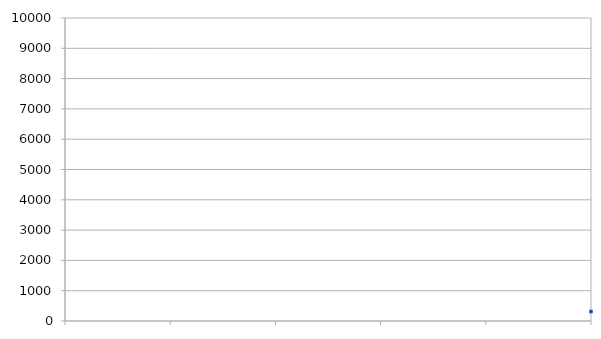
| Category | длины |
|---|---|
| 0 | 313 |
| 1 | 338 |
| 2 | 684 |
| 3 | 298 |
| 4 | 678 |
| 5 | 772 |
| 6 | 839 |
| 7 | 286 |
| 8 | 775 |
| 9 | 1319 |
| 10 | 887 |
| 11 | 441 |
| 12 | 1115 |
| 13 | 784 |
| 14 | 1188 |
| 15 | 815 |
| 16 | 444 |
| 17 | 231 |
| 18 | 725 |
| 19 | 113 |
| 20 | 1130 |
| 21 | 420 |
| 22 | 1179 |
| 23 | 787 |
| 24 | 869 |
| 25 | 1278 |
| 26 | 228 |
| 27 | 1534 |
| 28 | 1036 |
| 29 | 736 |
| 30 | 1319 |
| 31 | 1498 |
| 32 | 1528 |
| 33 | 866 |
| 34 | 850 |
| 35 | 575 |
| 36 | 1993 |
| 37 | 428 |
| 38 | 1051 |
| 39 | 259 |
| 40 | 1352 |
| 41 | 383 |
| 42 | 906 |
| 43 | 386 |
| 44 | 523 |
| 45 | 219 |
| 46 | 304 |
| 47 | 2133 |
| 48 | 486 |
| 49 | 1121 |
| 50 | 812 |
| 51 | 298 |
| 52 | 423 |
| 53 | 1926 |
| 54 | 465 |
| 55 | 225 |
| 56 | 298 |
| 57 | 1003 |
| 58 | 423 |
| 59 | 231 |
| 60 | 985 |
| 61 | 942 |
| 62 | 1061 |
| 63 | 2646 |
| 64 | 1094 |
| 65 | 848 |
| 66 | 1626 |
| 67 | 450 |
| 68 | 954 |
| 69 | 963 |
| 70 | 1109 |
| 71 | 1313 |
| 72 | 635 |
| 73 | 2166 |
| 74 | 1534 |
| 75 | 690 |
| 76 | 1334 |
| 77 | 815 |
| 78 | 632 |
| 79 | 903 |
| 80 | 736 |
| 81 | 404 |
| 82 | 924 |
| 83 | 617 |
| 84 | 183 |
| 85 | 711 |
| 86 | 705 |
| 87 | 802 |
| 88 | 1261 |
| 89 | 1413 |
| 90 | 1067 |
| 91 | 1273 |
| 92 | 423 |
| 93 | 286 |
| 94 | 875 |
| 95 | 1003 |
| 96 | 1367 |
| 97 | 493 |
| 98 | 559 |
| 99 | 593 |
| 100 | 401 |
| 101 | 408 |
| 102 | 2595 |
| 103 | 256 |
| 104 | 584 |
| 105 | 1398 |
| 106 | 268 |
| 107 | 1298 |
| 108 | 769 |
| 109 | 966 |
| 110 | 663 |
| 111 | 651 |
| 112 | 1562 |
| 113 | 1167 |
| 114 | 1550 |
| 115 | 587 |
| 116 | 1219 |
| 117 | 1273 |
| 118 | 2564 |
| 119 | 341 |
| 120 | 2640 |
| 121 | 793 |
| 122 | 547 |
| 123 | 1844 |
| 124 | 887 |
| 125 | 1009 |
| 126 | 790 |
| 127 | 1170 |
| 128 | 869 |
| 129 | 359 |
| 130 | 997 |
| 131 | 608 |
| 132 | 906 |
| 133 | 903 |
| 134 | 1000 |
| 135 | 189 |
| 136 | 860 |
| 137 | 429 |
| 138 | 1534 |
| 139 | 951 |
| 140 | 207 |
| 141 | 1416 |
| 142 | 1613 |
| 143 | 696 |
| 144 | 1474 |
| 145 | 602 |
| 146 | 329 |
| 147 | 237 |
| 148 | 338 |
| 149 | 383 |
| 150 | 1525 |
| 151 | 1191 |
| 152 | 520 |
| 153 | 453 |
| 154 | 1006 |
| 155 | 960 |
| 156 | 617 |
| 157 | 1750 |
| 158 | 726 |
| 159 | 1027 |
| 160 | 793 |
| 161 | 602 |
| 162 | 234 |
| 163 | 441 |
| 164 | 796 |
| 165 | 131 |
| 166 | 982 |
| 167 | 1009 |
| 168 | 310 |
| 169 | 909 |
| 170 | 505 |
| 171 | 994 |
| 172 | 663 |
| 173 | 1723 |
| 174 | 1462 |
| 175 | 1395 |
| 176 | 1088 |
| 177 | 1407 |
| 178 | 1219 |
| 179 | 1182 |
| 180 | 1440 |
| 181 | 201 |
| 182 | 960 |
| 183 | 979 |
| 184 | 960 |
| 185 | 1304 |
| 186 | 1489 |
| 187 | 1747 |
| 188 | 1173 |
| 189 | 1167 |
| 190 | 377 |
| 191 | 1376 |
| 192 | 1592 |
| 193 | 657 |
| 194 | 784 |
| 195 | 894 |
| 196 | 2017 |
| 197 | 1234 |
| 198 | 247 |
| 199 | 562 |
| 200 | 283 |
| 201 | 2488 |
| 202 | 790 |
| 203 | 1042 |
| 204 | 286 |
| 205 | 909 |
| 206 | 657 |
| 207 | 614 |
| 208 | 414 |
| 209 | 292 |
| 210 | 617 |
| 211 | 2364 |
| 212 | 556 |
| 213 | 344 |
| 214 | 444 |
| 215 | 623 |
| 216 | 565 |
| 217 | 675 |
| 218 | 951 |
| 219 | 1349 |
| 220 | 812 |
| 221 | 1419 |
| 222 | 1392 |
| 223 | 1358 |
| 224 | 228 |
| 225 | 784 |
| 226 | 608 |
| 227 | 617 |
| 228 | 1601 |
| 229 | 572 |
| 230 | 647 |
| 231 | 474 |
| 232 | 253 |
| 233 | 535 |
| 234 | 344 |
| 235 | 301 |
| 236 | 2710 |
| 237 | 1550 |
| 238 | 808 |
| 239 | 347 |
| 240 | 1140 |
| 241 | 1137 |
| 242 | 942 |
| 243 | 1146 |
| 244 | 1106 |
| 245 | 599 |
| 246 | 274 |
| 247 | 301 |
| 248 | 374 |
| 249 | 140 |
| 250 | 1680 |
| 251 | 1753 |
| 252 | 708 |
| 253 | 438 |
| 254 | 544 |
| 255 | 210 |
| 256 | 1240 |
| 257 | 1009 |
| 258 | 1632 |
| 259 | 1173 |
| 260 | 1000 |
| 261 | 766 |
| 262 | 1112 |
| 263 | 915 |
| 264 | 319 |
| 265 | 529 |
| 266 | 644 |
| 267 | 942 |
| 268 | 1626 |
| 269 | 1452 |
| 270 | 839 |
| 271 | 754 |
| 272 | 1294 |
| 273 | 1121 |
| 274 | 1015 |
| 275 | 465 |
| 276 | 985 |
| 277 | 827 |
| 278 | 818 |
| 279 | 1547 |
| 280 | 259 |
| 281 | 1465 |
| 282 | 897 |
| 283 | 635 |
| 284 | 1550 |
| 285 | 562 |
| 286 | 1571 |
| 287 | 1076 |
| 288 | 2200 |
| 289 | 675 |
| 290 | 663 |
| 291 | 356 |
| 292 | 195 |
| 293 | 2722 |
| 294 | 468 |
| 295 | 821 |
| 296 | 660 |
| 297 | 332 |
| 298 | 781 |
| 299 | 894 |
| 300 | 915 |
| 301 | 1173 |
| 302 | 1082 |
| 303 | 1118 |
| 304 | 1240 |
| 305 | 502 |
| 306 | 982 |
| 307 | 939 |
| 308 | 426 |
| 309 | 480 |
| 310 | 1258 |
| 311 | 1905 |
| 312 | 168 |
| 313 | 520 |
| 314 | 316 |
| 315 | 578 |
| 316 | 1209 |
| 317 | 821 |
| 318 | 860 |
| 319 | 769 |
| 320 | 262 |
| 321 | 842 |
| 322 | 490 |
| 323 | 344 |
| 324 | 708 |
| 325 | 289 |
| 326 | 1024 |
| 327 | 1182 |
| 328 | 726 |
| 329 | 2309 |
| 330 | 997 |
| 331 | 1954 |
| 332 | 137 |
| 333 | 292 |
| 334 | 392 |
| 335 | 374 |
| 336 | 623 |
| 337 | 657 |
| 338 | 329 |
| 339 | 717 |
| 340 | 319 |
| 341 | 329 |
| 342 | 553 |
| 343 | 632 |
| 344 | 584 |
| 345 | 1604 |
| 346 | 374 |
| 347 | 584 |
| 348 | 769 |
| 349 | 733 |
| 350 | 1073 |
| 351 | 860 |
| 352 | 502 |
| 353 | 860 |
| 354 | 1802 |
| 355 | 426 |
| 356 | 491 |
| 357 | 380 |
| 358 | 335 |
| 359 | 508 |
| 360 | 256 |
| 361 | 1188 |
| 362 | 1741 |
| 363 | 1820 |
| 364 | 854 |
| 365 | 289 |
| 366 | 222 |
| 367 | 213 |
| 368 | 584 |
| 369 | 745 |
| 370 | 414 |
| 371 | 177 |
| 372 | 447 |
| 373 | 429 |
| 374 | 280 |
| 375 | 1228 |
| 376 | 1328 |
| 377 | 909 |
| 378 | 365 |
| 379 | 286 |
| 380 | 496 |
| 381 | 1623 |
| 382 | 344 |
| 383 | 2965 |
| 384 | 884 |
| 385 | 304 |
| 386 | 1015 |
| 387 | 1389 |
| 388 | 417 |
| 389 | 177 |
| 390 | 972 |
| 391 | 1626 |
| 392 | 968 |
| 393 | 149 |
| 394 | 2121 |
| 395 | 228 |
| 396 | 912 |
| 397 | 1440 |
| 398 | 477 |
| 399 | 423 |
| 400 | 608 |
| 401 | 1127 |
| 402 | 541 |
| 403 | 1695 |
| 404 | 2306 |
| 405 | 486 |
| 406 | 954 |
| 407 | 1176 |
| 408 | 180 |
| 409 | 307 |
| 410 | 812 |
| 411 | 3363 |
| 412 | 1027 |
| 413 | 204 |
| 414 | 234 |
| 415 | 480 |
| 416 | 523 |
| 417 | 490 |
| 418 | 274 |
| 419 | 240 |
| 420 | 319 |
| 421 | 1647 |
| 422 | 189 |
| 423 | 216 |
| 424 | 641 |
| 425 | 909 |
| 426 | 629 |
| 427 | 326 |
| 428 | 626 |
| 429 | 909 |
| 430 | 596 |
| 431 | 1559 |
| 432 | 529 |
| 433 | 1556 |
| 434 | 1817 |
| 435 | 684 |
| 436 | 900 |
| 437 | 654 |
| 438 | 204 |
| 439 | 775 |
| 440 | 493 |
| 441 | 608 |
| 442 | 256 |
| 443 | 329 |
| 444 | 195 |
| 445 | 201 |
| 446 | 313 |
| 447 | 1729 |
| 448 | 322 |
| 449 | 183 |
| 450 | 1015 |
| 451 | 374 |
| 452 | 83 |
| 453 | 760 |
| 454 | 2279 |
| 455 | 1109 |
| 456 | 599 |
| 457 | 459 |
| 458 | 720 |
| 459 | 708 |
| 460 | 1516 |
| 461 | 869 |
| 462 | 720 |
| 463 | 1337 |
| 464 | 1018 |
| 465 | 1674 |
| 466 | 2048 |
| 467 | 775 |
| 468 | 1073 |
| 469 | 3144 |
| 470 | 556 |
| 471 | 295 |
| 472 | 514 |
| 473 | 824 |
| 474 | 511 |
| 475 | 635 |
| 476 | 1465 |
| 477 | 128 |
| 478 | 274 |
| 479 | 821 |
| 480 | 702 |
| 481 | 1477 |
| 482 | 1191 |
| 483 | 526 |
| 484 | 854 |
| 485 | 1039 |
| 486 | 1404 |
| 487 | 2294 |
| 488 | 1465 |
| 489 | 456 |
| 490 | 429 |
| 491 | 684 |
| 492 | 802 |
| 493 | 140 |
| 494 | 438 |
| 495 | 201 |
| 496 | 930 |
| 497 | 271 |
| 498 | 1155 |
| 499 | 1261 |
| 500 | 368 |
| 501 | 994 |
| 502 | 289 |
| 503 | 1653 |
| 504 | 256 |
| 505 | 253 |
| 506 | 666 |
| 507 | 641 |
| 508 | 1501 |
| 509 | 499 |
| 510 | 2087 |
| 511 | 2847 |
| 512 | 1471 |
| 513 | 1680 |
| 514 | 1137 |
| 515 | 1033 |
| 516 | 450 |
| 517 | 219 |
| 518 | 1389 |
| 519 | 1367 |
| 520 | 708 |
| 521 | 884 |
| 522 | 2516 |
| 523 | 195 |
| 524 | 678 |
| 525 | 371 |
| 526 | 438 |
| 527 | 918 |
| 528 | 611 |
| 529 | 638 |
| 530 | 748 |
| 531 | 1282 |
| 532 | 1024 |
| 533 | 824 |
| 534 | 441 |
| 535 | 751 |
| 536 | 368 |
| 537 | 805 |
| 538 | 499 |
| 539 | 474 |
| 540 | 1185 |
| 541 | 1173 |
| 542 | 2306 |
| 543 | 894 |
| 544 | 957 |
| 545 | 957 |
| 546 | 195 |
| 547 | 1975 |
| 548 | 1370 |
| 549 | 562 |
| 550 | 818 |
| 551 | 1194 |
| 552 | 880 |
| 553 | 322 |
| 554 | 2039 |
| 555 | 729 |
| 556 | 757 |
| 557 | 921 |
| 558 | 605 |
| 559 | 538 |
| 560 | 438 |
| 561 | 1006 |
| 562 | 1012 |
| 563 | 1304 |
| 564 | 666 |
| 565 | 1519 |
| 566 | 1030 |
| 567 | 480 |
| 568 | 994 |
| 569 | 1118 |
| 570 | 1349 |
| 571 | 778 |
| 572 | 435 |
| 573 | 1109 |
| 574 | 1106 |
| 575 | 799 |
| 576 | 453 |
| 577 | 1127 |
| 578 | 976 |
| 579 | 897 |
| 580 | 2847 |
| 581 | 1255 |
| 582 | 268 |
| 583 | 1419 |
| 584 | 1188 |
| 585 | 772 |
| 586 | 678 |
| 587 | 1349 |
| 588 | 808 |
| 589 | 1847 |
| 590 | 1632 |
| 591 | 1237 |
| 592 | 745 |
| 593 | 790 |
| 594 | 228 |
| 595 | 769 |
| 596 | 939 |
| 597 | 736 |
| 598 | 565 |
| 599 | 751 |
| 600 | 790 |
| 601 | 1173 |
| 602 | 1149 |
| 603 | 2670 |
| 604 | 669 |
| 605 | 486 |
| 606 | 228 |
| 607 | 1124 |
| 608 | 556 |
| 609 | 192 |
| 610 | 1838 |
| 611 | 930 |
| 612 | 957 |
| 613 | 1498 |
| 614 | 165 |
| 615 | 189 |
| 616 | 414 |
| 617 | 486 |
| 618 | 174 |
| 619 | 1258 |
| 620 | 824 |
| 621 | 887 |
| 622 | 1161 |
| 623 | 344 |
| 624 | 1623 |
| 625 | 1905 |
| 626 | 459 |
| 627 | 848 |
| 628 | 960 |
| 629 | 644 |
| 630 | 714 |
| 631 | 690 |
| 632 | 444 |
| 633 | 2288 |
| 634 | 1301 |
| 635 | 1383 |
| 636 | 839 |
| 637 | 1656 |
| 638 | 985 |
| 639 | 1462 |
| 640 | 772 |
| 641 | 736 |
| 642 | 277 |
| 643 | 2707 |
| 644 | 307 |
| 645 | 1182 |
| 646 | 1109 |
| 647 | 1401 |
| 648 | 1237 |
| 649 | 763 |
| 650 | 389 |
| 651 | 1610 |
| 652 | 2719 |
| 653 | 748 |
| 654 | 830 |
| 655 | 2209 |
| 656 | 1534 |
| 657 | 1234 |
| 658 | 474 |
| 659 | 547 |
| 660 | 389 |
| 661 | 647 |
| 662 | 1003 |
| 663 | 1127 |
| 664 | 493 |
| 665 | 726 |
| 666 | 772 |
| 667 | 1270 |
| 668 | 666 |
| 669 | 909 |
| 670 | 4296 |
| 671 | 420 |
| 672 | 745 |
| 673 | 751 |
| 674 | 1534 |
| 675 | 1149 |
| 676 | 1811 |
| 677 | 493 |
| 678 | 2014 |
| 679 | 954 |
| 680 | 429 |
| 681 | 966 |
| 682 | 468 |
| 683 | 435 |
| 684 | 395 |
| 685 | 234 |
| 686 | 240 |
| 687 | 198 |
| 688 | 338 |
| 689 | 2427 |
| 690 | 2965 |
| 691 | 243 |
| 692 | 310 |
| 693 | 432 |
| 694 | 651 |
| 695 | 884 |
| 696 | 632 |
| 697 | 599 |
| 698 | 3615 |
| 699 | 1188 |
| 700 | 559 |
| 701 | 3582 |
| 702 | 2534 |
| 703 | 2105 |
| 704 | 4806 |
| 705 | 222 |
| 706 | 2737 |
| 707 | 1455 |
| 708 | 857 |
| 709 | 1750 |
| 710 | 775 |
| 711 | 985 |
| 712 | 608 |
| 713 | 532 |
| 714 | 414 |
| 715 | 398 |
| 716 | 2576 |
| 717 | 821 |
| 718 | 915 |
| 719 | 1358 |
| 720 | 769 |
| 721 | 581 |
| 722 | 292 |
| 723 | 335 |
| 724 | 468 |
| 725 | 243 |
| 726 | 702 |
| 727 | 3166 |
| 728 | 1887 |
| 729 | 1182 |
| 730 | 3439 |
| 731 | 2643 |
| 732 | 693 |
| 733 | 1030 |
| 734 | 1030 |
| 735 | 657 |
| 736 | 486 |
| 737 | 787 |
| 738 | 772 |
| 739 | 951 |
| 740 | 754 |
| 741 | 261 |
| 742 | 550 |
| 743 | 204 |
| 744 | 1240 |
| 745 | 1428 |
| 746 | 945 |
| 747 | 881 |
| 748 | 748 |
| 749 | 976 |
| 750 | 1598 |
| 751 | 149 |
| 752 | 805 |
| 753 | 666 |
| 754 | 256 |
| 755 | 1407 |
| 756 | 2096 |
| 757 | 1383 |
| 758 | 350 |
| 759 | 587 |
| 760 | 1541 |
| 761 | 477 |
| 762 | 1012 |
| 763 | 1726 |
| 764 | 988 |
| 765 | 192 |
| 766 | 204 |
| 767 | 268 |
| 768 | 2704 |
| 769 | 243 |
| 770 | 711 |
| 771 | 666 |
| 772 | 1240 |
| 773 | 356 |
| 774 | 1322 |
| 775 | 675 |
| 776 | 344 |
| 777 | 739 |
| 778 | 1884 |
| 779 | 736 |
| 780 | 547 |
| 781 | 641 |
| 782 | 310 |
| 783 | 347 |
| 784 | 253 |
| 785 | 942 |
| 786 | 1395 |
| 787 | 326 |
| 788 | 2394 |
| 789 | 1923 |
| 790 | 696 |
| 791 | 502 |
| 792 | 1085 |
| 793 | 532 |
| 794 | 951 |
| 795 | 2999 |
| 796 | 523 |
| 797 | 417 |
| 798 | 335 |
| 799 | 460 |
| 800 | 1951 |
| 801 | 477 |
| 802 | 332 |
| 803 | 1844 |
| 804 | 429 |
| 805 | 2096 |
| 806 | 204 |
| 807 | 1313 |
| 808 | 572 |
| 809 | 259 |
| 810 | 447 |
| 811 | 939 |
| 812 | 784 |
| 813 | 720 |
| 814 | 365 |
| 815 | 1592 |
| 816 | 945 |
| 817 | 705 |
| 818 | 3275 |
| 819 | 192 |
| 820 | 408 |
| 821 | 326 |
| 822 | 796 |
| 823 | 231 |
| 824 | 502 |
| 825 | 635 |
| 826 | 1938 |
| 827 | 1698 |
| 828 | 796 |
| 829 | 219 |
| 830 | 942 |
| 831 | 1504 |
| 832 | 274 |
| 833 | 1692 |
| 834 | 517 |
| 835 | 657 |
| 836 | 1252 |
| 837 | 1373 |
| 838 | 1015 |
| 839 | 982 |
| 840 | 787 |
| 841 | 824 |
| 842 | 538 |
| 843 | 669 |
| 844 | 1741 |
| 845 | 745 |
| 846 | 1061 |
| 847 | 1225 |
| 848 | 404 |
| 849 | 802 |
| 850 | 651 |
| 851 | 8852 |
| 852 | 714 |
| 853 | 1413 |
| 854 | 2187 |
| 855 | 963 |
| 856 | 1291 |
| 857 | 1070 |
| 858 | 2002 |
| 859 | 444 |
| 860 | 432 |
| 861 | 675 |
| 862 | 860 |
| 863 | 1337 |
| 864 | 1158 |
| 865 | 1328 |
| 866 | 720 |
| 867 | 2121 |
| 868 | 265 |
| 869 | 1531 |
| 870 | 477 |
| 871 | 1146 |
| 872 | 292 |
| 873 | 1504 |
| 874 | 298 |
| 875 | 423 |
| 876 | 1522 |
| 877 | 930 |
| 878 | 301 |
| 879 | 3251 |
| 880 | 2479 |
| 881 | 942 |
| 882 | 520 |
| 883 | 1222 |
| 884 | 2500 |
| 885 | 2194 |
| 886 | 1276 |
| 887 | 1468 |
| 888 | 1932 |
| 889 | 508 |
| 890 | 663 |
| 891 | 295 |
| 892 | 860 |
| 893 | 997 |
| 894 | 884 |
| 895 | 945 |
| 896 | 1668 |
| 897 | 623 |
| 898 | 301 |
| 899 | 1067 |
| 900 | 468 |
| 901 | 1331 |
| 902 | 444 |
| 903 | 201 |
| 904 | 666 |
| 905 | 1121 |
| 906 | 1103 |
| 907 | 341 |
| 908 | 948 |
| 909 | 1632 |
| 910 | 329 |
| 911 | 2427 |
| 912 | 277 |
| 913 | 377 |
| 914 | 541 |
| 915 | 1228 |
| 916 | 687 |
| 917 | 2297 |
| 918 | 924 |
| 919 | 2194 |
| 920 | 2689 |
| 921 | 951 |
| 922 | 1808 |
| 923 | 295 |
| 924 | 1735 |
| 925 | 644 |
| 926 | 256 |
| 927 | 1370 |
| 928 | 341 |
| 929 | 2306 |
| 930 | 401 |
| 931 | 477 |
| 932 | 556 |
| 933 | 927 |
| 934 | 465 |
| 935 | 1328 |
| 936 | 447 |
| 937 | 1340 |
| 938 | 863 |
| 939 | 839 |
| 940 | 155 |
| 941 | 1258 |
| 942 | 654 |
| 943 | 915 |
| 944 | 1133 |
| 945 | 353 |
| 946 | 2768 |
| 947 | 1298 |
| 948 | 1288 |
| 949 | 881 |
| 950 | 292 |
| 951 | 1668 |
| 952 | 1410 |
| 953 | 969 |
| 954 | 1273 |
| 955 | 2434 |
| 956 | 1240 |
| 957 | 387 |
| 958 | 1458 |
| 959 | 1811 |
| 960 | 757 |
| 961 | 766 |
| 962 | 884 |
| 963 | 1222 |
| 964 | 2695 |
| 965 | 465 |
| 966 | 821 |
| 967 | 1483 |
| 968 | 1258 |
| 969 | 799 |
| 970 | 1458 |
| 971 | 441 |
| 972 | 1355 |
| 973 | 538 |
| 974 | 1337 |
| 975 | 736 |
| 976 | 426 |
| 977 | 611 |
| 978 | 2033 |
| 979 | 1130 |
| 980 | 1349 |
| 981 | 866 |
| 982 | 1285 |
| 983 | 729 |
| 984 | 1601 |
| 985 | 1009 |
| 986 | 590 |
| 987 | 520 |
| 988 | 626 |
| 989 | 979 |
| 990 | 1850 |
| 991 | 1480 |
| 992 | 1158 |
| 993 | 268 |
| 994 | 698 |
| 995 | 1033 |
| 996 | 2206 |
| 997 | 1225 |
| 998 | 1692 |
| 999 | 599 |
| 1000 | 617 |
| 1001 | 854 |
| 1002 | 787 |
| 1003 | 897 |
| 1004 | 1073 |
| 1005 | 1173 |
| 1006 | 890 |
| 1007 | 638 |
| 1008 | 945 |
| 1009 | 781 |
| 1010 | 462 |
| 1011 | 1301 |
| 1012 | 414 |
| 1013 | 1416 |
| 1014 | 675 |
| 1015 | 960 |
| 1016 | 508 |
| 1017 | 1018 |
| 1018 | 1367 |
| 1019 | 751 |
| 1020 | 429 |
| 1021 | 432 |
| 1022 | 486 |
| 1023 | 635 |
| 1024 | 581 |
| 1025 | 477 |
| 1026 | 1404 |
| 1027 | 2929 |
| 1028 | 174 |
| 1029 | 596 |
| 1030 | 1179 |
| 1031 | 3214 |
| 1032 | 1419 |
| 1033 | 493 |
| 1034 | 438 |
| 1035 | 660 |
| 1036 | 775 |
| 1037 | 708 |
| 1038 | 1027 |
| 1039 | 614 |
| 1040 | 195 |
| 1041 | 1626 |
| 1042 | 991 |
| 1043 | 644 |
| 1044 | 1285 |
| 1045 | 2610 |
| 1046 | 708 |
| 1047 | 927 |
| 1048 | 976 |
| 1049 | 408 |
| 1050 | 663 |
| 1051 | 1067 |
| 1052 | 1431 |
| 1053 | 344 |
| 1054 | 842 |
| 1055 | 772 |
| 1056 | 1361 |
| 1057 | 1331 |
| 1058 | 933 |
| 1059 | 1100 |
| 1060 | 1143 |
| 1061 | 982 |
| 1062 | 969 |
| 1063 | 942 |
| 1064 | 1416 |
| 1065 | 1307 |
| 1066 | 836 |
| 1067 | 930 |
| 1068 | 1376 |
| 1069 | 1446 |
| 1070 | 836 |
| 1071 | 1191 |
| 1072 | 201 |
| 1073 | 584 |
| 1074 | 237 |
| 1075 | 477 |
| 1076 | 1127 |
| 1077 | 2096 |
| 1078 | 535 |
| 1079 | 930 |
| 1080 | 1061 |
| 1081 | 1796 |
| 1082 | 520 |
| 1083 | 471 |
| 1084 | 1288 |
| 1085 | 532 |
| 1086 | 1115 |
| 1087 | 687 |
| 1088 | 1650 |
| 1089 | 578 |
| 1090 | 623 |
| 1091 | 897 |
| 1092 | 927 |
| 1093 | 900 |
| 1094 | 2294 |
| 1095 | 2737 |
| 1096 | 508 |
| 1097 | 720 |
| 1098 | 113 |
| 1099 | 4350 |
| 1100 | 1428 |
| 1101 | 875 |
| 1102 | 1762 |
| 1103 | 1537 |
| 1104 | 960 |
| 1105 | 985 |
| 1106 | 1513 |
| 1107 | 1401 |
| 1108 | 1744 |
| 1109 | 1471 |
| 1110 | 228 |
| 1111 | 1276 |
| 1112 | 1033 |
| 1113 | 1240 |
| 1114 | 912 |
| 1115 | 493 |
| 1116 | 1395 |
| 1117 | 1282 |
| 1118 | 720 |
| 1119 | 1480 |
| 1120 | 733 |
| 1121 | 143 |
| 1122 | 453 |
| 1123 | 1966 |
| 1124 | 535 |
| 1125 | 417 |
| 1126 | 644 |
| 1127 | 1954 |
| 1128 | 471 |
| 1129 | 1267 |
| 1130 | 699 |
| 1131 | 1832 |
| 1132 | 3582 |
| 1133 | 1082 |
| 1134 | 517 |
| 1135 | 535 |
| 1136 | 1826 |
| 1137 | 714 |
| 1138 | 1674 |
| 1139 | 1644 |
| 1140 | 912 |
| 1141 | 726 |
| 1142 | 362 |
| 1143 | 1413 |
| 1144 | 1222 |
| 1145 | 1209 |
| 1146 | 1188 |
| 1147 | 1222 |
| 1148 | 802 |
| 1149 | 1604 |
| 1150 | 1006 |
| 1151 | 1237 |
| 1152 | 815 |
| 1153 | 623 |
| 1154 | 1097 |
| 1155 | 2622 |
| 1156 | 921 |
| 1157 | 292 |
| 1158 | 723 |
| 1159 | 836 |
| 1160 | 1525 |
| 1161 | 1364 |
| 1162 | 723 |
| 1163 | 1434 |
| 1164 | 1553 |
| 1165 | 444 |
| 1166 | 2194 |
| 1167 | 1021 |
| 1168 | 2011 |
| 1169 | 377 |
| 1170 | 1610 |
| 1171 | 1061 |
| 1172 | 1188 |
| 1173 | 1103 |
| 1174 | 587 |
| 1175 | 1547 |
| 1176 | 1319 |
| 1177 | 550 |
| 1178 | 192 |
| 1179 | 131 |
| 1180 | 1811 |
| 1181 | 471 |
| 1182 | 474 |
| 1183 | 717 |
| 1184 | 183 |
| 1185 | 356 |
| 1186 | 247 |
| 1187 | 432 |
| 1188 | 553 |
| 1189 | 368 |
| 1190 | 195 |
| 1191 | 2017 |
| 1192 | 486 |
| 1193 | 6139 |
| 1194 | 2051 |
| 1195 | 532 |
| 1196 | 468 |
| 1197 | 1847 |
| 1198 | 629 |
| 1199 | 660 |
| 1200 | 1367 |
| 1201 | 404 |
| 1202 | 453 |
| 1203 | 1027 |
| 1204 | 490 |
| 1205 | 335 |
| 1206 | 319 |
| 1207 | 1626 |
| 1208 | 149 |
| 1209 | 177 |
| 1210 | 1452 |
| 1211 | 720 |
| 1212 | 408 |
| 1213 | 690 |
| 1214 | 687 |
| 1215 | 356 |
| 1216 | 240 |
| 1217 | 942 |
| 1218 | 602 |
| 1219 | 614 |
| 1220 | 456 |
| 1221 | 165 |
| 1222 | 292 |
| 1223 | 283 |
| 1224 | 225 |
| 1225 | 766 |
| 1226 | 408 |
| 1227 | 219 |
| 1228 | 356 |
| 1229 | 389 |
| 1230 | 769 |
| 1231 | 247 |
| 1232 | 1188 |
| 1233 | 468 |
| 1234 | 155 |
| 1235 | 262 |
| 1236 | 277 |
| 1237 | 681 |
| 1238 | 298 |
| 1239 | 362 |
| 1240 | 368 |
| 1241 | 304 |
| 1242 | 1143 |
| 1243 | 2245 |
| 1244 | 1039 |
| 1245 | 690 |
| 1246 | 772 |
| 1247 | 1474 |
| 1248 | 490 |
| 1249 | 569 |
| 1250 | 559 |
| 1251 | 1428 |
| 1252 | 286 |
| 1253 | 745 |
| 1254 | 660 |
| 1255 | 997 |
| 1256 | 483 |
| 1257 | 526 |
| 1258 | 1182 |
| 1259 | 1033 |
| 1260 | 1124 |
| 1261 | 1465 |
| 1262 | 2294 |
| 1263 | 1392 |
| 1264 | 490 |
| 1265 | 1349 |
| 1266 | 802 |
| 1267 | 1313 |
| 1268 | 644 |
| 1269 | 790 |
| 1270 | 784 |
| 1271 | 1583 |
| 1272 | 976 |
| 1273 | 651 |
| 1274 | 1179 |
| 1275 | 1051 |
| 1276 | 204 |
| 1277 | 432 |
| 1278 | 2765 |
| 1279 | 1243 |
| 1280 | 808 |
| 1281 | 620 |
| 1282 | 326 |
| 1283 | 3488 |
| 1284 | 3014 |
| 1285 | 720 |
| 1286 | 1000 |
| 1287 | 465 |
| 1288 | 2376 |
| 1289 | 1708 |
| 1290 | 1389 |
| 1291 | 216 |
| 1292 | 1301 |
| 1293 | 815 |
| 1294 | 988 |
| 1295 | 1298 |
| 1296 | 1051 |
| 1297 | 1726 |
| 1298 | 480 |
| 1299 | 2163 |
| 1300 | 335 |
| 1301 | 438 |
| 1302 | 693 |
| 1303 | 1686 |
| 1304 | 796 |
| 1305 | 1027 |
| 1306 | 2345 |
| 1307 | 274 |
| 1308 | 933 |
| 1309 | 590 |
| 1310 | 906 |
| 1311 | 408 |
| 1312 | 2622 |
| 1313 | 666 |
| 1314 | 237 |
| 1315 | 1592 |
| 1316 | 532 |
| 1317 | 1149 |
| 1318 | 1656 |
| 1319 | 383 |
| 1320 | 751 |
| 1321 | 1975 |
| 1322 | 1522 |
| 1323 | 985 |
| 1324 | 1276 |
| 1325 | 237 |
| 1326 | 751 |
| 1327 | 818 |
| 1328 | 948 |
| 1329 | 1489 |
| 1330 | 1534 |
| 1331 | 711 |
| 1332 | 1222 |
| 1333 | 365 |
| 1334 | 1422 |
| 1335 | 411 |
| 1336 | 228 |
| 1337 | 605 |
| 1338 | 380 |
| 1339 | 158 |
| 1340 | 216 |
| 1341 | 1422 |
| 1342 | 1167 |
| 1343 | 881 |
| 1344 | 1413 |
| 1345 | 1452 |
| 1346 | 799 |
| 1347 | 301 |
| 1348 | 1653 |
| 1349 | 447 |
| 1350 | 802 |
| 1351 | 335 |
| 1352 | 401 |
| 1353 | 1501 |
| 1354 | 490 |
| 1355 | 675 |
| 1356 | 465 |
| 1357 | 562 |
| 1358 | 775 |
| 1359 | 2992 |
| 1360 | 705 |
| 1361 | 496 |
| 1362 | 1310 |
| 1363 | 693 |
| 1364 | 423 |
| 1365 | 717 |
| 1366 | 906 |
| 1367 | 729 |
| 1368 | 608 |
| 1369 | 915 |
| 1370 | 1082 |
| 1371 | 675 |
| 1372 | 347 |
| 1373 | 1404 |
| 1374 | 483 |
| 1375 | 596 |
| 1376 | 626 |
| 1377 | 748 |
| 1378 | 775 |
| 1379 | 240 |
| 1380 | 326 |
| 1381 | 590 |
| 1382 | 918 |
| 1383 | 1474 |
| 1384 | 289 |
| 1385 | 690 |
| 1386 | 733 |
| 1387 | 705 |
| 1388 | 262 |
| 1389 | 684 |
| 1390 | 1328 |
| 1391 | 389 |
| 1392 | 705 |
| 1393 | 225 |
| 1394 | 924 |
| 1395 | 1343 |
| 1396 | 748 |
| 1397 | 757 |
| 1398 | 462 |
| 1399 | 872 |
| 1400 | 976 |
| 1401 | 687 |
| 1402 | 432 |
| 1403 | 493 |
| 1404 | 812 |
| 1405 | 2555 |
| 1406 | 830 |
| 1407 | 1264 |
| 1408 | 881 |
| 1409 | 1765 |
| 1410 | 1762 |
| 1411 | 763 |
| 1412 | 1155 |
| 1413 | 1343 |
| 1414 | 763 |
| 1415 | 1149 |
| 1416 | 1367 |
| 1417 | 1920 |
| 1418 | 1541 |
| 1419 | 1246 |
| 1420 | 1076 |
| 1421 | 857 |
| 1422 | 1252 |
| 1423 | 1607 |
| 1424 | 945 |
| 1425 | 1531 |
| 1426 | 654 |
| 1427 | 1249 |
| 1428 | 1531 |
| 1429 | 1021 |
| 1430 | 295 |
| 1431 | 660 |
| 1432 | 222 |
| 1433 | 1194 |
| 1434 | 1328 |
| 1435 | 872 |
| 1436 | 398 |
| 1437 | 447 |
| 1438 | 307 |
| 1439 | 289 |
| 1440 | 414 |
| 1441 | 957 |
| 1442 | 389 |
| 1443 | 502 |
| 1444 | 575 |
| 1445 | 620 |
| 1446 | 1225 |
| 1447 | 1774 |
| 1448 | 2318 |
| 1449 | 933 |
| 1450 | 149 |
| 1451 | 775 |
| 1452 | 1747 |
| 1453 | 1422 |
| 1454 | 793 |
| 1455 | 763 |
| 1456 | 234 |
| 1457 | 684 |
| 1458 | 890 |
| 1459 | 957 |
| 1460 | 1771 |
| 1461 | 350 |
| 1462 | 523 |
| 1463 | 1033 |
| 1464 | 632 |
| 1465 | 771 |
| 1466 | 1695 |
| 1467 | 1370 |
| 1468 | 1319 |
| 1469 | 1355 |
| 1470 | 471 |
| 1471 | 651 |
| 1472 | 2066 |
| 1473 | 620 |
| 1474 | 693 |
| 1475 | 1401 |
| 1476 | 1091 |
| 1477 | 316 |
| 1478 | 1291 |
| 1479 | 629 |
| 1480 | 319 |
| 1481 | 329 |
| 1482 | 596 |
| 1483 | 225 |
| 1484 | 647 |
| 1485 | 483 |
| 1486 | 3378 |
| 1487 | 374 |
| 1488 | 1179 |
| 1489 | 459 |
| 1490 | 395 |
| 1491 | 1920 |
| 1492 | 2072 |
| 1493 | 708 |
| 1494 | 857 |
| 1495 | 420 |
| 1496 | 1042 |
| 1497 | 1398 |
| 1498 | 1191 |
| 1499 | 1103 |
| 1500 | 1234 |
| 1501 | 359 |
| 1502 | 1106 |
| 1503 | 2090 |
| 1504 | 274 |
| 1505 | 3509 |
| 1506 | 417 |
| 1507 | 757 |
| 1508 | 2039 |
| 1509 | 1024 |
| 1510 | 787 |
| 1511 | 1322 |
| 1512 | 550 |
| 1513 | 729 |
| 1514 | 1036 |
| 1515 | 1042 |
| 1516 | 878 |
| 1517 | 1146 |
| 1518 | 183 |
| 1519 | 972 |
| 1520 | 1969 |
| 1521 | 687 |
| 1522 | 265 |
| 1523 | 1659 |
| 1524 | 793 |
| 1525 | 717 |
| 1526 | 1455 |
| 1527 | 1592 |
| 1528 | 2075 |
| 1529 | 310 |
| 1530 | 620 |
| 1531 | 493 |
| 1532 | 1064 |
| 1533 | 2033 |
| 1534 | 742 |
| 1535 | 1334 |
| 1536 | 678 |
| 1537 | 1252 |
| 1538 | 906 |
| 1539 | 562 |
| 1540 | 380 |
| 1541 | 824 |
| 1542 | 572 |
| 1543 | 578 |
| 1544 | 1103 |
| 1545 | 702 |
| 1546 | 736 |
| 1547 | 909 |
| 1548 | 1219 |
| 1549 | 1024 |
| 1550 | 1993 |
| 1551 | 216 |
| 1552 | 341 |
| 1553 | 587 |
| 1554 | 247 |
| 1555 | 1170 |
| 1556 | 474 |
| 1557 | 1264 |
| 1558 | 1061 |
| 1559 | 1313 |
| 1560 | 948 |
| 1561 | 298 |
| 1562 | 499 |
| 1563 | 1061 |
| 1564 | 1331 |
| 1565 | 480 |
| 1566 | 192 |
| 1567 | 2522 |
| 1568 | 912 |
| 1569 | 1143 |
| 1570 | 769 |
| 1571 | 884 |
| 1572 | 1431 |
| 1573 | 884 |
| 1574 | 341 |
| 1575 | 684 |
| 1576 | 663 |
| 1577 | 1370 |
| 1578 | 4223 |
| 1579 | 2084 |
| 1580 | 477 |
| 1581 | 183 |
| 1582 | 161 |
| 1583 | 371 |
| 1584 | 471 |
| 1585 | 575 |
| 1586 | 101 |
| 1587 | 447 |
| 1588 | 1294 |
| 1589 | 784 |
| 1590 | 1064 |
| 1591 | 1401 |
| 1592 | 866 |
| 1593 | 207 |
| 1594 | 1416 |
| 1595 | 414 |
| 1596 | 921 |
| 1597 | 957 |
| 1598 | 207 |
| 1599 | 177 |
| 1600 | 1346 |
| 1601 | 771 |
| 1602 | 830 |
| 1603 | 969 |
| 1604 | 271 |
| 1605 | 544 |
| 1606 | 1729 |
| 1607 | 693 |
| 1608 | 1042 |
| 1609 | 875 |
| 1610 | 1030 |
| 1611 | 201 |
| 1612 | 2352 |
| 1613 | 638 |
| 1614 | 748 |
| 1615 | 565 |
| 1616 | 559 |
| 1617 | 1091 |
| 1618 | 511 |
| 1619 | 2227 |
| 1620 | 365 |
| 1621 | 830 |
| 1622 | 2358 |
| 1623 | 547 |
| 1624 | 201 |
| 1625 | 280 |
| 1626 | 414 |
| 1627 | 329 |
| 1628 | 401 |
| 1629 | 225 |
| 1630 | 493 |
| 1631 | 1127 |
| 1632 | 398 |
| 1633 | 326 |
| 1634 | 1146 |
| 1635 | 344 |
| 1636 | 1331 |
| 1637 | 444 |
| 1638 | 572 |
| 1639 | 799 |
| 1640 | 247 |
| 1641 | 644 |
| 1642 | 1601 |
| 1643 | 1222 |
| 1644 | 717 |
| 1645 | 705 |
| 1646 | 529 |
| 1647 | 924 |
| 1648 | 2391 |
| 1649 | 1425 |
| 1650 | 1689 |
| 1651 | 1073 |
| 1652 | 365 |
| 1653 | 1577 |
| 1654 | 277 |
| 1655 | 1009 |
| 1656 | 256 |
| 1657 | 2582 |
| 1658 | 945 |
| 1659 | 453 |
| 1660 | 353 |
| 1661 | 432 |
| 1662 | 784 |
| 1663 | 1061 |
| 1664 | 903 |
| 1665 | 210 |
| 1666 | 796 |
| 1667 | 815 |
| 1668 | 1462 |
| 1669 | 942 |
| 1670 | 1762 |
| 1671 | 1310 |
| 1672 | 796 |
| 1673 | 915 |
| 1674 | 2341 |
| 1675 | 592 |
| 1676 | 256 |
| 1677 | 271 |
| 1678 | 1124 |
| 1679 | 754 |
| 1680 | 341 |
| 1681 | 581 |
| 1682 | 2995 |
| 1683 | 596 |
| 1684 | 1197 |
| 1685 | 1021 |
| 1686 | 216 |
| 1687 | 180 |
| 1688 | 219 |
| 1689 | 350 |
| 1690 | 942 |
| 1691 | 760 |
| 1692 | 1215 |
| 1693 | 338 |
| 1694 | 404 |
| 1695 | 183 |
| 1696 | 1206 |
| 1697 | 1416 |
| 1698 | 1073 |
| 1699 | 927 |
| 1700 | 772 |
| 1701 | 1021 |
| 1702 | 1055 |
| 1703 | 386 |
| 1704 | 480 |
| 1705 | 1273 |
| 1706 | 3615 |
| 1707 | 1610 |
| 1708 | 857 |
| 1709 | 881 |
| 1710 | 1753 |
| 1711 | 581 |
| 1712 | 693 |
| 1713 | 341 |
| 1714 | 681 |
| 1715 | 1626 |
| 1716 | 280 |
| 1717 | 620 |
| 1718 | 590 |
| 1719 | 423 |
| 1720 | 392 |
| 1721 | 769 |
| 1722 | 942 |
| 1723 | 201 |
| 1724 | 647 |
| 1725 | 477 |
| 1726 | 195 |
| 1727 | 225 |
| 1728 | 379 |
| 1729 | 1076 |
| 1730 | 1091 |
| 1731 | 1121 |
| 1732 | 1118 |
| 1733 | 1097 |
| 1734 | 1088 |
| 1735 | 1143 |
| 1736 | 635 |
| 1737 | 836 |
| 1738 | 936 |
| 1739 | 1130 |
| 1740 | 1003 |
| 1741 | 1042 |
| 1742 | 286 |
| 1743 | 1392 |
| 1744 | 1103 |
| 1745 | 401 |
| 1746 | 994 |
| 1747 | 1282 |
| 1748 | 739 |
| 1749 | 243 |
| 1750 | 2093 |
| 1751 | 547 |
| 1752 | 359 |
| 1753 | 915 |
| 1754 | 152 |
| 1755 | 623 |
| 1756 | 496 |
| 1757 | 1051 |
| 1758 | 417 |
| 1759 | 651 |
| 1760 | 228 |
| 1761 | 778 |
| 1762 | 985 |
| 1763 | 286 |
| 1764 | 502 |
| 1765 | 383 |
| 1766 | 827 |
| 1767 | 316 |
| 1768 | 1616 |
| 1769 | 717 |
| 1770 | 1616 |
| 1771 | 456 |
| 1772 | 945 |
| 1773 | 411 |
| 1774 | 277 |
| 1775 | 1009 |
| 1776 | 1838 |
| 1777 | 395 |
| 1778 | 401 |
| 1779 | 1349 |
| 1780 | 562 |
| 1781 | 1058 |
| 1782 | 523 |
| 1783 | 726 |
| 1784 | 638 |
| 1785 | 808 |
| 1786 | 1325 |
| 1787 | 532 |
| 1788 | 2628 |
| 1789 | 171 |
| 1790 | 374 |
| 1791 | 742 |
| 1792 | 277 |
| 1793 | 486 |
| 1794 | 474 |
| 1795 | 1471 |
| 1796 | 1340 |
| 1797 | 186 |
| 1798 | 523 |
| 1799 | 1386 |
| 1800 | 708 |
| 1801 | 708 |
| 1802 | 857 |
| 1803 | 1091 |
| 1804 | 371 |
| 1805 | 444 |
| 1806 | 2412 |
| 1807 | 280 |
| 1808 | 435 |
| 1809 | 611 |
| 1810 | 824 |
| 1811 | 687 |
| 1812 | 550 |
| 1813 | 1030 |
| 1814 | 693 |
| 1815 | 775 |
| 1816 | 2595 |
| 1817 | 280 |
| 1818 | 733 |
| 1819 | 994 |
| 1820 | 2300 |
| 1821 | 441 |
| 1822 | 979 |
| 1823 | 1143 |
| 1824 | 857 |
| 1825 | 1528 |
| 1826 | 1647 |
| 1827 | 423 |
| 1828 | 1340 |
| 1829 | 942 |
| 1830 | 1352 |
| 1831 | 1124 |
| 1832 | 1206 |
| 1833 | 2276 |
| 1834 | 4217 |
| 1835 | 4311 |
| 1836 | 383 |
| 1837 | 508 |
| 1838 | 1185 |
| 1839 | 1644 |
| 1840 | 1240 |
| 1841 | 2060 |
| 1842 | 423 |
| 1843 | 417 |
| 1844 | 1826 |
| 1845 | 1143 |
| 1846 | 1923 |
| 1847 | 477 |
| 1848 | 471 |
| 1849 | 1112 |
| 1850 | 1322 |
| 1851 | 1629 |
| 1852 | 1595 |
| 1853 | 2825 |
| 1854 | 499 |
| 1855 | 250 |
| 1856 | 283 |
| 1857 | 918 |
| 1858 | 897 |
| 1859 | 763 |
| 1860 | 171 |
| 1861 | 247 |
| 1862 | 222 |
| 1863 | 702 |
| 1864 | 726 |
| 1865 | 754 |
| 1866 | 1127 |
| 1867 | 906 |
| 1868 | 1249 |
| 1869 | 717 |
| 1870 | 894 |
| 1871 | 307 |
| 1872 | 332 |
| 1873 | 1732 |
| 1874 | 520 |
| 1875 | 757 |
| 1876 | 660 |
| 1877 | 593 |
| 1878 | 3187 |
| 1879 | 903 |
| 1880 | 532 |
| 1881 | 705 |
| 1882 | 408 |
| 1883 | 687 |
| 1884 | 304 |
| 1885 | 256 |
| 1886 | 229 |
| 1887 | 1334 |
| 1888 | 450 |
| 1889 | 301 |
| 1890 | 669 |
| 1891 | 447 |
| 1892 | 395 |
| 1893 | 717 |
| 1894 | 1513 |
| 1895 | 778 |
| 1896 | 432 |
| 1897 | 1173 |
| 1898 | 666 |
| 1899 | 335 |
| 1900 | 417 |
| 1901 | 1288 |
| 1902 | 4727 |
| 1903 | 969 |
| 1904 | 654 |
| 1905 | 532 |
| 1906 | 927 |
| 1907 | 939 |
| 1908 | 2643 |
| 1909 | 1127 |
| 1910 | 505 |
| 1911 | 1276 |
| 1912 | 432 |
| 1913 | 523 |
| 1914 | 726 |
| 1915 | 757 |
| 1916 | 1258 |
| 1917 | 332 |
| 1918 | 429 |
| 1919 | 839 |
| 1920 | 280 |
| 1921 | 681 |
| 1922 | 538 |
| 1923 | 1085 |
| 1924 | 1304 |
| 1925 | 1474 |
| 1926 | 2172 |
| 1927 | 696 |
| 1928 | 161 |
| 1929 | 1197 |
| 1930 | 493 |
| 1931 | 802 |
| 1932 | 1006 |
| 1933 | 599 |
| 1934 | 359 |
| 1935 | 1021 |
| 1936 | 450 |
| 1937 | 1158 |
| 1938 | 1701 |
| 1939 | 541 |
| 1940 | 1276 |
| 1941 | 666 |
| 1942 | 505 |
| 1943 | 1610 |
| 1944 | 1018 |
| 1945 | 660 |
| 1946 | 614 |
| 1947 | 1428 |
| 1948 | 268 |
| 1949 | 824 |
| 1950 | 742 |
| 1951 | 1562 |
| 1952 | 1130 |
| 1953 | 681 |
| 1954 | 171 |
| 1955 | 1219 |
| 1956 | 632 |
| 1957 | 1191 |
| 1958 | 420 |
| 1959 | 444 |
| 1960 | 1255 |
| 1961 | 1124 |
| 1962 | 1908 |
| 1963 | 2288 |
| 1964 | 751 |
| 1965 | 751 |
| 1966 | 322 |
| 1967 | 626 |
| 1968 | 231 |
| 1969 | 444 |
| 1970 | 1544 |
| 1971 | 1301 |
| 1972 | 748 |
| 1973 | 575 |
| 1974 | 887 |
| 1975 | 237 |
| 1976 | 578 |
| 1977 | 887 |
| 1978 | 541 |
| 1979 | 2023 |
| 1980 | 444 |
| 1981 | 1091 |
| 1982 | 1088 |
| 1983 | 1844 |
| 1984 | 1729 |
| 1985 | 368 |
| 1986 | 1228 |
| 1987 | 723 |
| 1988 | 158 |
| 1989 | 301 |
| 1990 | 745 |
| 1991 | 1143 |
| 1992 | 550 |
| 1993 | 541 |
| 1994 | 912 |
| 1995 | 392 |
| 1996 | 189 |
| 1997 | 751 |
| 1998 | 2570 |
| 1999 | 1018 |
| 2000 | 2701 |
| 2001 | 1389 |
| 2002 | 781 |
| 2003 | 137 |
| 2004 | 417 |
| 2005 | 216 |
| 2006 | 1726 |
| 2007 | 657 |
| 2008 | 307 |
| 2009 | 590 |
| 2010 | 2075 |
| 2011 | 189 |
| 2012 | 930 |
| 2013 | 681 |
| 2014 | 189 |
| 2015 | 374 |
| 2016 | 863 |
| 2017 | 1243 |
| 2018 | 1380 |
| 2019 | 705 |
| 2020 | 1021 |
| 2021 | 1194 |
| 2022 | 392 |
| 2023 | 988 |
| 2024 | 1304 |
| 2025 | 1811 |
| 2026 | 332 |
| 2027 | 966 |
| 2028 | 2710 |
| 2029 | 322 |
| 2030 | 429 |
| 2031 | 496 |
| 2032 | 769 |
| 2033 | 666 |
| 2034 | 890 |
| 2035 | 1322 |
| 2036 | 997 |
| 2037 | 383 |
| 2038 | 1805 |
| 2039 | 1486 |
| 2040 | 1528 |
| 2041 | 1231 |
| 2042 | 350 |
| 2043 | 602 |
| 2044 | 3360 |
| 2045 | 450 |
| 2046 | 693 |
| 2047 | 1310 |
| 2048 | 1003 |
| 2049 | 1972 |
| 2050 | 1146 |
| 2051 | 2370 |
| 2052 | 386 |
| 2053 | 2567 |
| 2054 | 1203 |
| 2055 | 204 |
| 2056 | 863 |
| 2057 | 411 |
| 2058 | 231 |
| 2059 | 426 |
| 2060 | 2090 |
| 2061 | 368 |
| 2062 | 222 |
| 2063 | 201 |
| 2064 | 247 |
| 2065 | 1161 |
| 2066 | 377 |
| 2067 | 778 |
| 2068 | 1993 |
| 2069 | 2680 |
| 2070 | 268 |
| 2071 | 480 |
| 2072 | 1200 |
| 2073 | 860 |
| 2074 | 1240 |
| 2075 | 1273 |
| 2076 | 772 |
| 2077 | 517 |
| 2078 | 681 |
| 2079 | 930 |
| 2080 | 295 |
| 2081 | 316 |
| 2082 | 906 |
| 2083 | 684 |
| 2084 | 626 |
| 2085 | 881 |
| 2086 | 1419 |
| 2087 | 635 |
| 2088 | 417 |
| 2089 | 842 |
| 2090 | 584 |
| 2091 | 933 |
| 2092 | 1689 |
| 2093 | 1027 |
| 2094 | 590 |
| 2095 | 748 |
| 2096 | 408 |
| 2097 | 906 |
| 2098 | 1112 |
| 2099 | 569 |
| 2100 | 210 |
| 2101 | 781 |
| 2102 | 1896 |
| 2103 | 1264 |
| 2104 | 356 |
| 2105 | 471 |
| 2106 | 1413 |
| 2107 | 404 |
| 2108 | 1446 |
| 2109 | 459 |
| 2110 | 678 |
| 2111 | 577 |
| 2112 | 1051 |
| 2113 | 562 |
| 2114 | 666 |
| 2115 | 1383 |
| 2116 | 544 |
| 2117 | 180 |
| 2118 | 717 |
| 2119 | 359 |
| 2120 | 541 |
| 2121 | 401 |
| 2122 | 310 |
| 2123 | 581 |
| 2124 | 316 |
| 2125 | 374 |
| 2126 | 268 |
| 2127 | 207 |
| 2128 | 438 |
| 2129 | 705 |
| 2130 | 389 |
| 2131 | 283 |
| 2132 | 848 |
| 2133 | 322 |
| 2134 | 632 |
| 2135 | 766 |
| 2136 | 313 |
| 2137 | 1206 |
| 2138 | 2099 |
| 2139 | 477 |
| 2140 | 377 |
| 2141 | 1206 |
| 2142 | 535 |
| 2143 | 486 |
| 2144 | 1061 |
| 2145 | 2090 |
| 2146 | 638 |
| 2147 | 945 |
| 2148 | 1826 |
| 2149 | 1598 |
| 2150 | 991 |
| 2151 | 936 |
| 2152 | 766 |
| 2153 | 894 |
| 2154 | 969 |
| 2155 | 775 |
| 2156 | 1504 |
| 2157 | 854 |
| 2158 | 198 |
| 2159 | 237 |
| 2160 | 544 |
| 2161 | 1121 |
| 2162 | 641 |
| 2163 | 687 |
| 2164 | 207 |
| 2165 | 3068 |
| 2166 | 1941 |
| 2167 | 1018 |
| 2168 | 781 |
| 2169 | 3248 |
| 2170 | 2664 |
| 2171 | 1124 |
| 2172 | 3342 |
| 2173 | 997 |
| 2174 | 787 |
| 2175 | 702 |
| 2176 | 875 |
| 2177 | 1987 |
| 2178 | 1018 |
| 2179 | 1240 |
| 2180 | 869 |
| 2181 | 708 |
| 2182 | 957 |
| 2183 | 222 |
| 2184 | 723 |
| 2185 | 2443 |
| 2186 | 155 |
| 2187 | 775 |
| 2188 | 2324 |
| 2189 | 1519 |
| 2190 | 1003 |
| 2191 | 748 |
| 2192 | 2005 |
| 2193 | 1124 |
| 2194 | 760 |
| 2195 | 2352 |
| 2196 | 1018 |
| 2197 | 644 |
| 2198 | 486 |
| 2199 | 1024 |
| 2200 | 729 |
| 2201 | 1228 |
| 2202 | 815 |
| 2203 | 729 |
| 2204 | 647 |
| 2205 | 1197 |
| 2206 | 1416 |
| 2207 | 3090 |
| 2208 | 1097 |
| 2209 | 857 |
| 2210 | 851 |
| 2211 | 660 |
| 2212 | 243 |
| 2213 | 180 |
| 2214 | 225 |
| 2215 | 690 |
| 2216 | 459 |
| 2217 | 1161 |
| 2218 | 547 |
| 2219 | 280 |
| 2220 | 353 |
| 2221 | 651 |
| 2222 | 763 |
| 2223 | 332 |
| 2224 | 748 |
| 2225 | 4381 |
| 2226 | 3421 |
| 2227 | 483 |
| 2228 | 1024 |
| 2229 | 2063 |
| 2230 | 742 |
| 2231 | 1307 |
| 2232 | 863 |
| 2233 | 2145 |
| 2234 | 408 |
| 2235 | 775 |
| 2236 | 1070 |
| 2237 | 310 |
| 2238 | 976 |
| 2239 | 161 |
| 2240 | 775 |
| 2241 | 1179 |
| 2242 | 417 |
| 2243 | 927 |
| 2244 | 1440 |
| 2245 | 2336 |
| 2246 | 435 |
| 2247 | 514 |
| 2248 | 1249 |
| 2249 | 1115 |
| 2250 | 216 |
| 2251 | 660 |
| 2252 | 1130 |
| 2253 | 292 |
| 2254 | 496 |
| 2255 | 976 |
| 2256 | 994 |
| 2257 | 1197 |
| 2258 | 824 |
| 2259 | 219 |
| 2260 | 976 |
| 2261 | 1003 |
| 2262 | 1073 |
| 2263 | 769 |
| 2264 | 635 |
| 2265 | 775 |
| 2266 | 547 |
| 2267 | 927 |
| 2268 | 769 |
| 2269 | 1665 |
| 2270 | 985 |
| 2271 | 997 |
| 2272 | 243 |
| 2273 | 2971 |
| 2274 | 954 |
| 2275 | 1006 |
| 2276 | 1364 |
| 2277 | 1255 |
| 2278 | 763 |
| 2279 | 289 |
| 2280 | 581 |
| 2281 | 477 |
| 2282 | 1018 |
| 2283 | 775 |
| 2284 | 2476 |
| 2285 | 1140 |
| 2286 | 638 |
| 2287 | 991 |
| 2288 | 936 |
| 2289 | 936 |
| 2290 | 511 |
| 2291 | 341 |
| 2292 | 769 |
| 2293 | 2406 |
| 2294 | 1246 |
| 2295 | 338 |
| 2296 | 824 |
| 2297 | 620 |
| 2298 | 584 |
| 2299 | 1668 |
| 2300 | 429 |
| 2301 | 347 |
| 2302 | 851 |
| 2303 | 739 |
| 2304 | 1039 |
| 2305 | 775 |
| 2306 | 259 |
| 2307 | 301 |
| 2308 | 286 |
| 2309 | 326 |
| 2310 | 234 |
| 2311 | 268 |
| 2312 | 626 |
| 2313 | 1212 |
| 2314 | 560 |
| 2315 | 875 |
| 2316 | 329 |
| 2317 | 1112 |
| 2318 | 976 |
| 2319 | 404 |
| 2320 | 310 |
| 2321 | 395 |
| 2322 | 253 |
| 2323 | 1422 |
| 2324 | 1753 |
| 2325 | 1212 |
| 2326 | 775 |
| 2327 | 556 |
| 2328 | 976 |
| 2329 | 900 |
| 2330 | 815 |
| 2331 | 1550 |
| 2332 | 1000 |
| 2333 | 1322 |
| 2334 | 720 |
| 2335 | 1030 |
| 2336 | 444 |
| 2337 | 1000 |
| 2338 | 887 |
| 2339 | 420 |
| 2340 | 1055 |
| 2341 | 2160 |
| 2342 | 2406 |
| 2343 | 2403 |
| 2344 | 1228 |
| 2345 | 1294 |
| 2346 | 1431 |
| 2347 | 1492 |
| 2348 | 2968 |
| 2349 | 1252 |
| 2350 | 1304 |
| 2351 | 1197 |
| 2352 | 641 |
| 2353 | 414 |
| 2354 | 1030 |
| 2355 | 572 |
| 2356 | 720 |
| 2357 | 991 |
| 2358 | 948 |
| 2359 | 511 |
| 2360 | 1395 |
| 2361 | 3184 |
| 2362 | 1146 |
| 2363 | 739 |
| 2364 | 1389 |
| 2365 | 1969 |
| 2366 | 1325 |
| 2367 | 1562 |
| 2368 | 207 |
| 2369 | 757 |
| 2370 | 1337 |
| 2371 | 793 |
| 2372 | 371 |
| 2373 | 1225 |
| 2374 | 760 |
| 2375 | 760 |
| 2376 | 729 |
| 2377 | 638 |
| 2378 | 1079 |
| 2379 | 617 |
| 2380 | 614 |
| 2381 | 3861 |
| 2382 | 1055 |
| 2383 | 1088 |
| 2384 | 247 |
| 2385 | 3108 |
| 2386 | 2066 |
| 2387 | 754 |
| 2388 | 350 |
| 2389 | 1380 |
| 2390 | 602 |
| 2391 | 2968 |
| 2392 | 1486 |
| 2393 | 6394 |
| 2394 | 1410 |
| 2395 | 1996 |
| 2396 | 1847 |
| 2397 | 4028 |
| 2398 | 918 |
| 2399 | 2546 |
| 2400 | 890 |
| 2401 | 1850 |
| 2402 | 857 |
| 2403 | 948 |
| 2404 | 1127 |
| 2405 | 869 |
| 2406 | 611 |
| 2407 | 1267 |
| 2408 | 1261 |
| 2409 | 1051 |
| 2410 | 787 |
| 2411 | 808 |
| 2412 | 878 |
| 2413 | 329 |
| 2414 | 295 |
| 2415 | 207 |
| 2416 | 216 |
| 2417 | 1796 |
| 2418 | 2093 |
| 2419 | 3485 |
| 2420 | 1270 |
| 2421 | 3515 |
| 2422 | 897 |
| 2423 | 1990 |
| 2424 | 1018 |
| 2425 | 1234 |
| 2426 | 869 |
| 2427 | 708 |
| 2428 | 957 |
| 2429 | 222 |
| 2430 | 723 |
| 2431 | 2449 |
| 2432 | 356 |
| 2433 | 344 |
| 2434 | 675 |
| 2435 | 344 |
| 2436 | 945 |
| 2437 | 620 |
| 2438 | 757 |
| 2439 | 772 |
| 2440 | 578 |
| 2441 | 866 |
| 2442 | 268 |
| 2443 | 1468 |
| 2444 | 1559 |
| 2445 | 921 |
| 2446 | 644 |
| 2447 | 404 |
| 2448 | 2388 |
| 2449 | 263 |
| 2450 | 957 |
| 2451 | 383 |
| 2452 | 277 |
| 2453 | 447 |
| 2454 | 575 |
| 2455 | 1951 |
| 2456 | 1164 |
| 2457 | 480 |
| 2458 | 1556 |
| 2459 | 632 |
| 2460 | 414 |
| 2461 | 356 |
| 2462 | 286 |
| 2463 | 268 |
| 2464 | 444 |
| 2465 | 1258 |
| 2466 | 1000 |
| 2467 | 1729 |
| 2468 | 1039 |
| 2469 | 1541 |
| 2470 | 198 |
| 2471 | 295 |
| 2472 | 447 |
| 2473 | 450 |
| 2474 | 733 |
| 2475 | 739 |
| 2476 | 1935 |
| 2477 | 326 |
| 2478 | 225 |
| 2479 | 486 |
| 2480 | 362 |
| 2481 | 368 |
| 2482 | 262 |
| 2483 | 1279 |
| 2484 | 1510 |
| 2485 | 3184 |
| 2486 | 411 |
| 2487 | 1313 |
| 2488 | 538 |
| 2489 | 775 |
| 2490 | 1097 |
| 2491 | 1188 |
| 2492 | 1659 |
| 2493 | 2011 |
| 2494 | 1167 |
| 2495 | 1091 |
| 2496 | 1197 |
| 2497 | 672 |
| 2498 | 2361 |
| 2499 | 918 |
| 2500 | 222 |
| 2501 | 271 |
| 2502 | 830 |
| 2503 | 611 |
| 2504 | 544 |
| 2505 | 860 |
| 2506 | 1337 |
| 2507 | 590 |
| 2508 | 477 |
| 2509 | 863 |
| 2510 | 608 |
| 2511 | 799 |
| 2512 | 729 |
| 2513 | 295 |
| 2514 | 714 |
| 2515 | 657 |
| 2516 | 702 |
| 2517 | 395 |
| 2518 | 921 |
| 2519 | 942 |
| 2520 | 1206 |
| 2521 | 404 |
| 2522 | 1468 |
| 2523 | 462 |
| 2524 | 1155 |
| 2525 | 793 |
| 2526 | 277 |
| 2527 | 790 |
| 2528 | 271 |
| 2529 | 344 |
| 2530 | 897 |
| 2531 | 660 |
| 2532 | 1835 |
| 2533 | 432 |
| 2534 | 1346 |
| 2535 | 641 |
| 2536 | 1027 |
| 2537 | 1774 |
| 2538 | 365 |
| 2539 | 1270 |
| 2540 | 845 |
| 2541 | 1504 |
| 2542 | 1917 |
| 2543 | 748 |
| 2544 | 2148 |
| 2545 | 833 |
| 2546 | 313 |
| 2547 | 286 |
| 2548 | 556 |
| 2549 | 490 |
| 2550 | 678 |
| 2551 | 374 |
| 2552 | 417 |
| 2553 | 666 |
| 2554 | 854 |
| 2555 | 751 |
| 2556 | 799 |
| 2557 | 669 |
| 2558 | 1097 |
| 2559 | 319 |
| 2560 | 1358 |
| 2561 | 857 |
| 2562 | 875 |
| 2563 | 1070 |
| 2564 | 1373 |
| 2565 | 729 |
| 2566 | 635 |
| 2567 | 1234 |
| 2568 | 872 |
| 2569 | 198 |
| 2570 | 927 |
| 2571 | 2142 |
| 2572 | 1130 |
| 2573 | 1015 |
| 2574 | 171 |
| 2575 | 1434 |
| 2576 | 553 |
| 2577 | 365 |
| 2578 | 1322 |
| 2579 | 836 |
| 2580 | 626 |
| 2581 | 657 |
| 2582 | 559 |
| 2583 | 599 |
| 2584 | 821 |
| 2585 | 1021 |
| 2586 | 1009 |
| 2587 | 1121 |
| 2588 | 872 |
| 2589 | 1070 |
| 2590 | 374 |
| 2591 | 985 |
| 2592 | 705 |
| 2593 | 268 |
| 2594 | 438 |
| 2595 | 3372 |
| 2596 | 2503 |
| 2597 | 903 |
| 2598 | 371 |
| 2599 | 842 |
| 2600 | 1130 |
| 2601 | 942 |
| 2602 | 1212 |
| 2603 | 1817 |
| 2604 | 247 |
| 2605 | 869 |
| 2606 | 562 |
| 2607 | 213 |
| 2608 | 514 |
| 2609 | 322 |
| 2610 | 842 |
| 2611 | 186 |
| 2612 | 681 |
| 2613 | 538 |
| 2614 | 860 |
| 2615 | 830 |
| 2616 | 872 |
| 2617 | 590 |
| 2618 | 651 |
| 2619 | 620 |
| 2620 | 799 |
| 2621 | 335 |
| 2622 | 906 |
| 2623 | 1790 |
| 2624 | 2121 |
| 2625 | 4241 |
| 2626 | 1425 |
| 2627 | 909 |
| 2628 | 414 |
| 2629 | 1541 |
| 2630 | 523 |
| 2631 | 654 |
| 2632 | 1996 |
| 2633 | 462 |
| 2634 | 1070 |
| 2635 | 359 |
| 2636 | 505 |
| 2637 | 584 |
| 2638 | 398 |
| 2639 | 310 |
| 2640 | 386 |
| 2641 | 362 |
| 2642 | 1061 |
| 2643 | 432 |
| 2644 | 666 |
| 2645 | 438 |
| 2646 | 183 |
| 2647 | 1073 |
| 2648 | 982 |
| 2649 | 301 |
| 2650 | 362 |
| 2651 | 550 |
| 2652 | 2768 |
| 2653 | 362 |
| 2654 | 1601 |
| 2655 | 477 |
| 2656 | 687 |
| 2657 | 903 |
| 2658 | 538 |
| 2659 | 2585 |
| 2660 | 821 |
| 2661 | 544 |
| 2662 | 483 |
| 2663 | 1225 |
| 2664 | 1762 |
| 2665 | 924 |
| 2666 | 414 |
| 2667 | 231 |
| 2668 | 152 |
| 2669 | 2257 |
| 2670 | 675 |
| 2671 | 511 |
| 2672 | 544 |
| 2673 | 398 |
| 2674 | 435 |
| 2675 | 2212 |
| 2676 | 1088 |
| 2677 | 365 |
| 2678 | 2458 |
| 2679 | 602 |
| 2680 | 490 |
| 2681 | 890 |
| 2682 | 2063 |
| 2683 | 493 |
| 2684 | 189 |
| 2685 | 796 |
| 2686 | 1808 |
| 2687 | 1182 |
| 2688 | 301 |
| 2689 | 693 |
| 2690 | 392 |
| 2691 | 231 |
| 2692 | 395 |
| 2693 | 1829 |
| 2694 | 781 |
| 2695 | 462 |
| 2696 | 572 |
| 2697 | 1191 |
| 2698 | 1674 |
| 2699 | 784 |
| 2700 | 757 |
| 2701 | 708 |
| 2702 | 617 |
| 2703 | 839 |
| 2704 | 1291 |
| 2705 | 1677 |
| 2706 | 1316 |
| 2707 | 447 |
| 2708 | 644 |
| 2709 | 720 |
| 2710 | 927 |
| 2711 | 1039 |
| 2712 | 447 |
| 2713 | 493 |
| 2714 | 1370 |
| 2715 | 350 |
| 2716 | 304 |
| 2717 | 240 |
| 2718 | 2822 |
| 2719 | 1471 |
| 2720 | 268 |
| 2721 | 702 |
| 2722 | 1550 |
| 2723 | 322 |
| 2724 | 1389 |
| 2725 | 760 |
| 2726 | 2327 |
| 2727 | 1744 |
| 2728 | 532 |
| 2729 | 520 |
| 2730 | 404 |
| 2731 | 483 |
| 2732 | 775 |
| 2733 | 1048 |
| 2734 | 790 |
| 2735 | 520 |
| 2736 | 930 |
| 2737 | 265 |
| 2738 | 386 |
| 2739 | 2206 |
| 2740 | 729 |
| 2741 | 1146 |
| 2742 | 623 |
| 2743 | 128 |
| 2744 | 635 |
| 2745 | 1477 |
| 2746 | 329 |
| 2747 | 247 |
| 2748 | 332 |
| 2749 | 754 |
| 2750 | 499 |
| 2751 | 1212 |
| 2752 | 2734 |
| 2753 | 1471 |
| 2754 | 474 |
| 2755 | 796 |
| 2756 | 2030 |
| 2757 | 2245 |
| 2758 | 963 |
| 2759 | 647 |
| 2760 | 277 |
| 2761 | 532 |
| 2762 | 608 |
| 2763 | 760 |
| 2764 | 702 |
| 2765 | 757 |
| 2766 | 572 |
| 2767 | 189 |
| 2768 | 581 |
| 2769 | 502 |
| 2770 | 219 |
| 2771 | 590 |
| 2772 | 480 |
| 2773 | 632 |
| 2774 | 177 |
| 2775 | 329 |
| 2776 | 213 |
| 2777 | 775 |
| 2778 | 316 |
| 2779 | 274 |
| 2780 | 547 |
| 2781 | 341 |
| 2782 | 1623 |
| 2783 | 1000 |
| 2784 | 350 |
| 2785 | 1088 |
| 2786 | 775 |
| 2787 | 523 |
| 2788 | 386 |
| 2789 | 1127 |
| 2790 | 392 |
| 2791 | 966 |
| 2792 | 1124 |
| 2793 | 1434 |
| 2794 | 942 |
| 2795 | 256 |
| 2796 | 1042 |
| 2797 | 480 |
| 2798 | 374 |
| 2799 | 897 |
| 2800 | 414 |
| 2801 | 292 |
| 2802 | 614 |
| 2803 | 784 |
| 2804 | 669 |
| 2805 | 775 |
| 2806 | 605 |
| 2807 | 1531 |
| 2808 | 547 |
| 2809 | 374 |
| 2810 | 395 |
| 2811 | 1079 |
| 2812 | 432 |
| 2813 | 2194 |
| 2814 | 538 |
| 2815 | 608 |
| 2816 | 1738 |
| 2817 | 669 |
| 2818 | 1580 |
| 2819 | 265 |
| 2820 | 1203 |
| 2821 | 1452 |
| 2822 | 638 |
| 2823 | 395 |
| 2824 | 429 |
| 2825 | 1252 |
| 2826 | 1307 |
| 2827 | 493 |
| 2828 | 672 |
| 2829 | 1790 |
| 2830 | 933 |
| 2831 | 177 |
| 2832 | 435 |
| 2833 | 912 |
| 2834 | 587 |
| 2835 | 951 |
| 2836 | 821 |
| 2837 | 1471 |
| 2838 | 596 |
| 2839 | 4581 |
| 2840 | 483 |
| 2841 | 1659 |
| 2842 | 438 |
| 2843 | 307 |
| 2844 | 3855 |
| 2845 | 775 |
| 2846 | 5280 |
| 2847 | 1021 |
| 2848 | 98 |
| 2849 | 696 |
| 2850 | 951 |
| 2851 | 1413 |
| 2852 | 332 |
| 2853 | 444 |
| 2854 | 1534 |
| 2855 | 2087 |
| 2856 | 979 |
| 2857 | 2789 |
| 2858 | 1525 |
| 2859 | 1033 |
| 2860 | 1291 |
| 2861 | 966 |
| 2862 | 875 |
| 2863 | 1513 |
| 2864 | 368 |
| 2865 | 578 |
| 2866 | 541 |
| 2867 | 572 |
| 2868 | 1367 |
| 2869 | 420 |
| 2870 | 3521 |
| 2871 | 775 |
| 2872 | 420 |
| 2873 | 644 |
| 2874 | 414 |
| 2875 | 441 |
| 2876 | 168 |
| 2877 | 529 |
| 2878 | 553 |
| 2879 | 2500 |
| 2880 | 1598 |
| 2881 | 1434 |
| 2882 | 3153 |
| 2883 | 775 |
| 2884 | 450 |
| 2885 | 1334 |
| 2886 | 1373 |
| 2887 | 1689 |
| 2888 | 2534 |
| 2889 | 2734 |
| 2890 | 1033 |
| 2891 | 575 |
| 2892 | 2069 |
| 2893 | 420 |
| 2894 | 1000 |
| 2895 | 347 |
| 2896 | 277 |
| 2897 | 2491 |
| 2898 | 766 |
| 2899 | 1331 |
| 2900 | 833 |
| 2901 | 845 |
| 2902 | 1215 |
| 2903 | 234 |
| 2904 | 237 |
| 2905 | 1246 |
| 2906 | 766 |
| 2907 | 869 |
| 2908 | 213 |
| 2909 | 714 |
| 2910 | 441 |
| 2911 | 733 |
| 2912 | 423 |
| 2913 | 1793 |
| 2914 | 796 |
| 2915 | 435 |
| 2916 | 240 |
| 2917 | 948 |
| 2918 | 1683 |
| 2919 | 1349 |
| 2920 | 760 |
| 2921 | 897 |
| 2922 | 678 |
| 2923 | 939 |
| 2924 | 1048 |
| 2925 | 985 |
| 2926 | 1516 |
| 2927 | 1015 |
| 2928 | 690 |
| 2929 | 380 |
| 2930 | 1058 |
| 2931 | 969 |
| 2932 | 1206 |
| 2933 | 480 |
| 2934 | 1875 |
| 2935 | 426 |
| 2936 | 1547 |
| 2937 | 347 |
| 2938 | 1610 |
| 2939 | 565 |
| 2940 | 1884 |
| 2941 | 262 |
| 2942 | 654 |
| 2943 | 1097 |
| 2944 | 429 |
| 2945 | 1301 |
| 2946 | 623 |
| 2947 | 966 |
| 2948 | 535 |
| 2949 | 699 |
| 2950 | 1279 |
| 2951 | 3199 |
| 2952 | 1188 |
| 2953 | 253 |
| 2954 | 259 |
| 2955 | 304 |
| 2956 | 301 |
| 2957 | 1137 |
| 2958 | 672 |
| 2959 | 1307 |
| 2960 | 453 |
| 2961 | 927 |
| 2962 | 2151 |
| 2963 | 1972 |
| 2964 | 690 |
| 2965 | 1140 |
| 2966 | 623 |
| 2967 | 2036 |
| 2968 | 441 |
| 2969 | 1307 |
| 2970 | 222 |
| 2971 | 581 |
| 2972 | 1003 |
| 2973 | 198 |
| 2974 | 961 |
| 2975 | 848 |
| 2976 | 790 |
| 2977 | 881 |
| 2978 | 395 |
| 2979 | 237 |
| 2980 | 377 |
| 2981 | 508 |
| 2982 | 2023 |
| 2983 | 660 |
| 2984 | 420 |
| 2985 | 678 |
| 2986 | 864 |
| 2987 | 180 |
| 2988 | 1346 |
| 2989 | 310 |
| 2990 | 201 |
| 2991 | 912 |
| 2992 | 490 |
| 2993 | 1088 |
| 2994 | 966 |
| 2995 | 808 |
| 2996 | 301 |
| 2997 | 1018 |
| 2998 | 927 |
| 2999 | 468 |
| 3000 | 827 |
| 3001 | 991 |
| 3002 | 1334 |
| 3003 | 796 |
| 3004 | 912 |
| 3005 | 2792 |
| 3006 | 1061 |
| 3007 | 632 |
| 3008 | 1234 |
| 3009 | 2631 |
| 3010 | 1741 |
| 3011 | 1322 |
| 3012 | 720 |
| 3013 | 186 |
| 3014 | 1179 |
| 3015 | 1610 |
| 3016 | 231 |
| 3017 | 1370 |
| 3018 | 587 |
| 3019 | 2206 |
| 3020 | 408 |
| 3021 | 726 |
| 3022 | 927 |
| 3023 | 1586 |
| 3024 | 1015 |
| 3025 | 1823 |
| 3026 | 2145 |
| 3027 | 760 |
| 3028 | 483 |
| 3029 | 1191 |
| 3030 | 787 |
| 3031 | 2509 |
| 3032 | 818 |
| 3033 | 903 |
| 3034 | 2816 |
| 3035 | 894 |
| 3036 | 1768 |
| 3037 | 2424 |
| 3038 | 1386 |
| 3039 | 1012 |
| 3040 | 2546 |
| 3041 | 866 |
| 3042 | 1203 |
| 3043 | 833 |
| 3044 | 3770 |
| 3045 | 596 |
| 3046 | 1167 |
| 3047 | 972 |
| 3048 | 1112 |
| 3049 | 918 |
| 3050 | 705 |
| 3051 | 538 |
| 3052 | 927 |
| 3053 | 720 |
| 3054 | 839 |
| 3055 | 936 |
| 3056 | 717 |
| 3057 | 292 |
| 3058 | 626 |
| 3059 | 1021 |
| 3060 | 429 |
| 3061 | 796 |
| 3062 | 1850 |
| 3063 | 477 |
| 3064 | 499 |
| 3065 | 575 |
| 3066 | 341 |
| 3067 | 171 |
| 3068 | 1033 |
| 3069 | 332 |
| 3070 | 617 |
| 3071 | 584 |
| 3072 | 635 |
| 3073 | 1313 |
| 3074 | 1392 |
| 3075 | 757 |
| 3076 | 915 |
| 3077 | 1477 |
| 3078 | 3488 |
| 3079 | 745 |
| 3080 | 669 |
| 3081 | 550 |
| 3082 | 1085 |
| 3083 | 918 |
| 3084 | 1364 |
| 3085 | 808 |
| 3086 | 368 |
| 3087 | 301 |
| 3088 | 681 |
| 3089 | 468 |
| 3090 | 736 |
| 3091 | 1161 |
| 3092 | 301 |
| 3093 | 1291 |
| 3094 | 1638 |
| 3095 | 772 |
| 3096 | 1507 |
| 3097 | 435 |
| 3098 | 304 |
| 3099 | 383 |
| 3100 | 793 |
| 3101 | 839 |
| 3102 | 1109 |
| 3103 | 1367 |
| 3104 | 1944 |
| 3105 | 550 |
| 3106 | 620 |
| 3107 | 666 |
| 3108 | 432 |
| 3109 | 720 |
| 3110 | 1483 |
| 3111 | 611 |
| 3112 | 514 |
| 3113 | 490 |
| 3114 | 2540 |
| 3115 | 572 |
| 3116 | 502 |
| 3117 | 742 |
| 3118 | 456 |
| 3119 | 2549 |
| 3120 | 502 |
| 3121 | 1039 |
| 3122 | 411 |
| 3123 | 2099 |
| 3124 | 969 |
| 3125 | 1273 |
| 3126 | 729 |
| 3127 | 1033 |
| 3128 | 963 |
| 3129 | 708 |
| 3130 | 265 |
| 3131 | 1301 |
| 3132 | 1875 |
| 3133 | 651 |
| 3134 | 793 |
| 3135 | 915 |
| 3136 | 2631 |
| 3137 | 611 |
| 3138 | 976 |
| 3139 | 860 |
| 3140 | 1124 |
| 3141 | 684 |
| 3142 | 942 |
| 3143 | 1355 |
| 3144 | 2443 |
| 3145 | 860 |
| 3146 | 669 |
| 3147 | 2801 |
| 3148 | 757 |
| 3149 | 572 |
| 3150 | 502 |
| 3151 | 657 |
| 3152 | 316 |
| 3153 | 517 |
| 3154 | 474 |
| 3155 | 605 |
| 3156 | 702 |
| 3157 | 602 |
| 3158 | 833 |
| 3159 | 602 |
| 3160 | 833 |
| 3161 | 1076 |
| 3162 | 447 |
| 3163 | 857 |
| 3164 | 818 |
| 3165 | 444 |
| 3166 | 1428 |
| 3167 | 1322 |
| 3168 | 1176 |
| 3169 | 921 |
| 3170 | 499 |
| 3171 | 2352 |
| 3172 | 1340 |
| 3173 | 1064 |
| 3174 | 969 |
| 3175 | 1284 |
| 3176 | 1273 |
| 3177 | 471 |
| 3178 | 787 |
| 3179 | 371 |
| 3180 | 663 |
| 3181 | 808 |
| 3182 | 1073 |
| 3183 | 532 |
| 3184 | 2795 |
| 3185 | 2686 |
| 3186 | 2291 |
| 3187 | 508 |
| 3188 | 681 |
| 3189 | 2303 |
| 3190 | 994 |
| 3191 | 1343 |
| 3192 | 1018 |
| 3193 | 1352 |
| 3194 | 1182 |
| 3195 | 1711 |
| 3196 | 1380 |
| 3197 | 3785 |
| 3198 | 1401 |
| 3199 | 763 |
| 3200 | 693 |
| 3201 | 927 |
| 3202 | 605 |
| 3203 | 1200 |
| 3204 | 2154 |
| 3205 | 1255 |
| 3206 | 854 |
| 3207 | 584 |
| 3208 | 1267 |
| 3209 | 1152 |
| 3210 | 875 |
| 3211 | 1152 |
| 3212 | 726 |
| 3213 | 997 |
| 3214 | 884 |
| 3215 | 575 |
| 3216 | 523 |
| 3217 | 532 |
| 3218 | 1094 |
| 3219 | 821 |
| 3220 | 319 |
| 3221 | 1586 |
| 3222 | 903 |
| 3223 | 532 |
| 3224 | 720 |
| 3225 | 2446 |
| 3226 | 1118 |
| 3227 | 353 |
| 3228 | 629 |
| 3229 | 368 |
| 3230 | 207 |
| 3231 | 2197 |
| 3232 | 490 |
| 3233 | 1301 |
| 3234 | 1519 |
| 3235 | 213 |
| 3236 | 839 |
| 3237 | 3053 |
| 3238 | 2613 |
| 3239 | 1656 |
| 3240 | 2907 |
| 3241 | 307 |
| 3242 | 456 |
| 3243 | 2086 |
| 3244 | 219 |
| 3245 | 927 |
| 3246 | 1370 |
| 3247 | 520 |
| 3248 | 1349 |
| 3249 | 933 |
| 3250 | 465 |
| 3251 | 729 |
| 3252 | 459 |
| 3253 | 890 |
| 3254 | 1030 |
| 3255 | 177 |
| 3256 | 678 |
| 3257 | 271 |
| 3258 | 380 |
| 3259 | 186 |
| 3260 | 256 |
| 3261 | 237 |
| 3262 | 429 |
| 3263 | 502 |
| 3264 | 1723 |
| 3265 | 1064 |
| 3266 | 842 |
| 3267 | 471 |
| 3268 | 1504 |
| 3269 | 143 |
| 3270 | 462 |
| 3271 | 757 |
| 3272 | 763 |
| 3273 | 1206 |
| 3274 | 471 |
| 3275 | 368 |
| 3276 | 808 |
| 3277 | 158 |
| 3278 | 897 |
| 3279 | 1030 |
| 3280 | 1106 |
| 3281 | 1225 |
| 3282 | 1407 |
| 3283 | 1143 |
| 3284 | 298 |
| 3285 | 839 |
| 3286 | 1282 |
| 3287 | 654 |
| 3288 | 2321 |
| 3289 | 894 |
| 3290 | 1179 |
| 3291 | 681 |
| 3292 | 1969 |
| 3293 | 520 |
| 3294 | 301 |
| 3295 | 414 |
| 3296 | 1884 |
| 3297 | 447 |
| 3298 | 1167 |
| 3299 | 189 |
| 3300 | 2400 |
| 3301 | 228 |
| 3302 | 161 |
| 3303 | 775 |
| 3304 | 322 |
| 3305 | 338 |
| 3306 | 2218 |
| 3307 | 611 |
| 3308 | 930 |
| 3309 | 490 |
| 3310 | 569 |
| 3311 | 1170 |
| 3312 | 274 |
| 3313 | 383 |
| 3314 | 441 |
| 3315 | 408 |
| 3316 | 304 |
| 3317 | 462 |
| 3318 | 660 |
| 3319 | 638 |
| 3320 | 775 |
| 3321 | 259 |
| 3322 | 286 |
| 3323 | 775 |
| 3324 | 796 |
| 3325 | 2288 |
| 3326 | 802 |
| 3327 | 815 |
| 3328 | 1313 |
| 3329 | 1465 |
| 3330 | 681 |
| 3331 | 1844 |
| 3332 | 1021 |
| 3333 | 620 |
| 3334 | 2406 |
| 3335 | 690 |
| 3336 | 216 |
| 3337 | 985 |
| 3338 | 326 |
| 3339 | 234 |
| 3340 | 565 |
| 3341 | 620 |
| 3342 | 395 |
| 3343 | 2045 |
| 3344 | 643 |
| 3345 | 338 |
| 3346 | 669 |
| 3347 | 332 |
| 3348 | 386 |
| 3349 | 350 |
| 3350 | 468 |
| 3351 | 2321 |
| 3352 | 189 |
| 3353 | 395 |
| 3354 | 189 |
| 3355 | 493 |
| 3356 | 502 |
| 3357 | 1659 |
| 3358 | 1206 |
| 3359 | 723 |
| 3360 | 165 |
| 3361 | 1319 |
| 3362 | 739 |
| 3363 | 401 |
| 3364 | 900 |
| 3365 | 1064 |
| 3366 | 830 |
| 3367 | 878 |
| 3368 | 365 |
| 3369 | 319 |
| 3370 | 298 |
| 3371 | 1212 |
| 3372 | 216 |
| 3373 | 256 |
| 3374 | 250 |
| 3375 | 720 |
| 3376 | 161 |
| 3377 | 474 |
| 3378 | 897 |
| 3379 | 605 |
| 3380 | 2030 |
| 3381 | 799 |
| 3382 | 793 |
| 3383 | 1085 |
| 3384 | 1458 |
| 3385 | 1176 |
| 3386 | 763 |
| 3387 | 900 |
| 3388 | 699 |
| 3389 | 763 |
| 3390 | 626 |
| 3391 | 808 |
| 3392 | 429 |
| 3393 | 1164 |
| 3394 | 1194 |
| 3395 | 1191 |
| 3396 | 1012 |
| 3397 | 757 |
| 3398 | 1471 |
| 3399 | 1316 |
| 3400 | 2926 |
| 3401 | 1097 |
| 3402 | 1219 |
| 3403 | 717 |
| 3404 | 808 |
| 3405 | 344 |
| 3406 | 805 |
| 3407 | 1547 |
| 3408 | 2096 |
| 3409 | 1030 |
| 3410 | 1626 |
| 3411 | 1805 |
| 3412 | 2102 |
| 3413 | 404 |
| 3414 | 994 |
| 3415 | 1884 |
| 3416 | 851 |
| 3417 | 681 |
| 3418 | 890 |
| 3419 | 705 |
| 3420 | 1176 |
| 3421 | 1601 |
| 3422 | 1146 |
| 3423 | 1307 |
| 3424 | 186 |
| 3425 | 584 |
| 3426 | 1349 |
| 3427 | 584 |
| 3428 | 948 |
| 3429 | 985 |
| 3430 | 818 |
| 3431 | 1091 |
| 3432 | 1802 |
| 3433 | 799 |
| 3434 | 1140 |
| 3435 | 319 |
| 3436 | 1796 |
| 3437 | 435 |
| 3438 | 1200 |
| 3439 | 1000 |
| 3440 | 277 |
| 3441 | 1176 |
| 3442 | 1501 |
| 3443 | 590 |
| 3444 | 966 |
| 3445 | 1443 |
| 3446 | 344 |
| 3447 | 584 |
| 3448 | 1462 |
| 3449 | 231 |
| 3450 | 177 |
| 3451 | 1018 |
| 3452 | 863 |
| 3453 | 1534 |
| 3454 | 796 |
| 3455 | 277 |
| 3456 | 2127 |
| 3457 | 529 |
| 3458 | 1437 |
| 3459 | 1373 |
| 3460 | 623 |
| 3461 | 903 |
| 3462 | 2142 |
| 3463 | 432 |
| 3464 | 1161 |
| 3465 | 802 |
| 3466 | 1990 |
| 3467 | 799 |
| 3468 | 2841 |
| 3469 | 833 |
| 3470 | 647 |
| 3471 | 2862 |
| 3472 | 499 |
| 3473 | 966 |
| 3474 | 550 |
| 3475 | 997 |
| 3476 | 395 |
| 3477 | 963 |
| 3478 | 1343 |
| 3479 | 1191 |
| 3480 | 696 |
| 3481 | 681 |
| 3482 | 462 |
| 3483 | 775 |
| 3484 | 259 |
| 3485 | 903 |
| 3486 | 775 |
| 3487 | 569 |
| 3488 | 1103 |
| 3489 | 204 |
| 3490 | 332 |
| 3491 | 878 |
| 3492 | 4253 |
| 3493 | 2039 |
| 3494 | 936 |
| 3495 | 344 |
| 3496 | 544 |
| 3497 | 447 |
| 3498 | 1082 |
| 3499 | 438 |
| 3500 | 751 |
| 3501 | 954 |
| 3502 | 678 |
| 3503 | 414 |
| 3504 | 441 |
| 3505 | 168 |
| 3506 | 529 |
| 3507 | 356 |
| 3508 | 398 |
| 3509 | 180 |
| 3510 | 775 |
| 3511 | 960 |
| 3512 | 569 |
| 3513 | 1137 |
| 3514 | 617 |
| 3515 | 1064 |
| 3516 | 556 |
| 3517 | 268 |
| 3518 | 943 |
| 3519 | 913 |
| 3520 | 806 |
| 3521 | 918 |
| 3522 | 1878 |
| 3523 | 184 |
| 3524 | 438 |
| 3525 | 1149 |
| 3526 | 1577 |
| 3527 | 1458 |
| 3528 | 708 |
| 3529 | 1149 |
| 3530 | 1079 |
| 3531 | 1896 |
| 3532 | 2430 |
| 3533 | 903 |
| 3534 | 3005 |
| 3535 | 982 |
| 3536 | 477 |
| 3537 | 1337 |
| 3538 | 930 |
| 3539 | 1030 |
| 3540 | 335 |
| 3541 | 1951 |
| 3542 | 1203 |
| 3543 | 793 |
| 3544 | 483 |
| 3545 | 2096 |
| 3546 | 1504 |
| 3547 | 1252 |
| 3548 | 404 |
| 3549 | 1352 |
| 3550 | 1389 |
| 3551 | 736 |
| 3552 | 675 |
| 3553 | 486 |
| 3554 | 720 |
| 3555 | 201 |
| 3556 | 1510 |
| 3557 | 2039 |
| 3558 | 1935 |
| 3559 | 587 |
| 3560 | 1750 |
| 3561 | 2555 |
| 3562 | 711 |
| 3563 | 711 |
| 3564 | 3649 |
| 3565 | 143 |
| 3566 | 2160 |
| 3567 | 483 |
| 3568 | 1449 |
| 3569 | 900 |
| 3570 | 171 |
| 3571 | 757 |
| 3572 | 1680 |
| 3573 | 781 |
| 3574 | 265 |
| 3575 | 775 |
| 3576 | 298 |
| 3577 | 769 |
| 3578 | 538 |
| 3579 | 775 |
| 3580 | 368 |
| 3581 | 696 |
| 3582 | 763 |
| 3583 | 1389 |
| 3584 | 775 |
| 3585 | 471 |
| 3586 | 763 |
| 3587 | 763 |
| 3588 | 1255 |
| 3589 | 1364 |
| 3590 | 1006 |
| 3591 | 954 |
| 3592 | 2567 |
| 3593 | 243 |
| 3594 | 997 |
| 3595 | 985 |
| 3596 | 1665 |
| 3597 | 769 |
| 3598 | 775 |
| 3599 | 2841 |
| 3600 | 821 |
| 3601 | 1483 |
| 3602 | 414 |
| 3603 | 878 |
| 3604 | 1182 |
| 3605 | 404 |
| 3606 | 693 |
| 3607 | 356 |
| 3608 | 1027 |
| 3609 | 1219 |
| 3610 | 1219 |
| 3611 | 942 |
| 3612 | 881 |
| 3613 | 280 |
| 3614 | 1692 |
| 3615 | 569 |
| 3616 | 332 |
| 3617 | 954 |
| 3618 | 1234 |
| 3619 | 1012 |
| 3620 | 319 |
| 3621 | 1237 |
| 3622 | 216 |
| 3623 | 1082 |
| 3624 | 2263 |
| 3625 | 2276 |
| 3626 | 541 |
| 3627 | 429 |
| 3628 | 186 |
| 3629 | 1820 |
| 3630 | 207 |
| 3631 | 611 |
| 3632 | 875 |
| 3633 | 906 |
| 3634 | 1346 |
| 3635 | 1167 |
| 3636 | 1173 |
| 3637 | 921 |
| 3638 | 1055 |
| 3639 | 875 |
| 3640 | 857 |
| 3641 | 3418 |
| 3642 | 2995 |
| 3643 | 608 |
| 3644 | 1164 |
| 3645 | 641 |
| 3646 | 797 |
| 3647 | 628 |
| 3648 | 1148 |
| 3649 | 826 |
| 3650 | 356 |
| 3651 | 2190 |
| 3652 | 1097 |
| 3653 | 754 |
| 3654 | 784 |
| 3655 | 1519 |
| 3656 | 897 |
| 3657 | 608 |
| 3658 | 769 |
| 3659 | 1948 |
| 3660 | 924 |
| 3661 | 1058 |
| 3662 | 216 |
| 3663 | 1343 |
| 3664 | 1188 |
| 3665 | 775 |
| 3666 | 1793 |
| 3667 | 1367 |
| 3668 | 556 |
| 3669 | 802 |
| 3670 | 307 |
| 3671 | 878 |
| 3672 | 1826 |
| 3673 | 620 |
| 3674 | 1732 |
| 3675 | 1978 |
| 3676 | 459 |
| 3677 | 553 |
| 3678 | 784 |
| 3679 | 960 |
| 3680 | 2336 |
| 3681 | 1410 |
| 3682 | 985 |
| 3683 | 432 |
| 3684 | 866 |
| 3685 | 1765 |
| 3686 | 787 |
| 3687 | 553 |
| 3688 | 471 |
| 3689 | 2251 |
| 3690 | 158 |
| 3691 | 2236 |
| 3692 | 1158 |
| 3693 | 395 |
| 3694 | 1541 |
| 3695 | 1197 |
| 3696 | 453 |
| 3697 | 678 |
| 3698 | 1601 |
| 3699 | 1212 |
| 3700 | 1106 |
| 3701 | 1127 |
| 3702 | 319 |
| 3703 | 663 |
| 3704 | 134 |
| 3705 | 2968 |
| 3706 | 602 |
| 3707 | 1380 |
| 3708 | 523 |
| 3709 | 286 |
| 3710 | 326 |
| 3711 | 426 |
| 3712 | 165 |
| 3713 | 578 |
| 3714 | 991 |
| 3715 | 1674 |
| 3716 | 605 |
| 3717 | 702 |
| 3718 | 532 |
| 3719 | 2588 |
| 3720 | 924 |
| 3721 | 979 |
| 3722 | 821 |
| 3723 | 726 |
| 3724 | 641 |
| 3725 | 1055 |
| 3726 | 152 |
| 3727 | 775 |
| 3728 | 152 |
| 3729 | 720 |
| 3730 | 490 |
| 3731 | 818 |
| 3732 | 1307 |
| 3733 | 723 |
| 3734 | 748 |
| 3735 | 3172 |
| 3736 | 310 |
| 3737 | 222 |
| 3738 | 286 |
| 3739 | 948 |
| 3740 | 277 |
| 3741 | 1698 |
| 3742 | 438 |
| 3743 | 538 |
| 3744 | 629 |